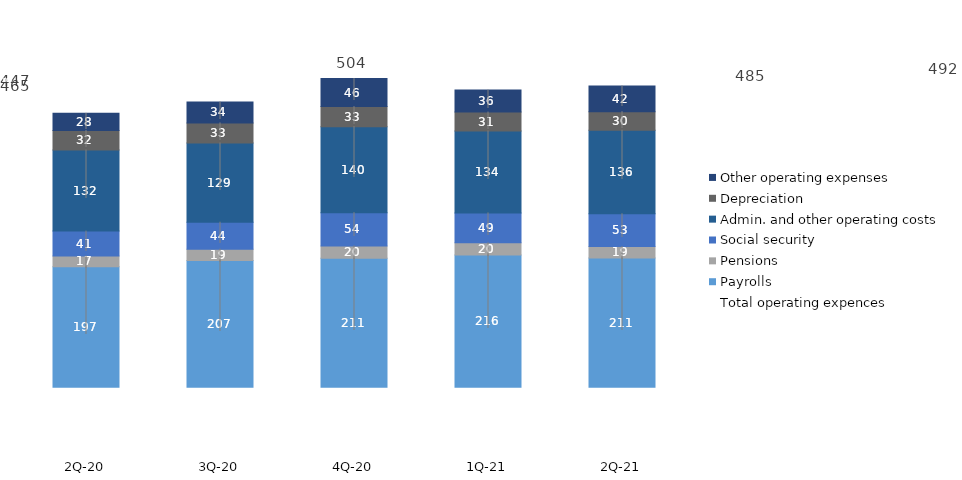
| Category | Payrolls | Pensions | Social security | Admin. and other operating costs | Depreciation | Other operating expenses |
|---|---|---|---|---|---|---|
| 2Q-21 | 210.961 | 18.611 | 53.458 | 136.384 | 30.262 | 41.881 |
| 1Q-21 | 215.824 | 19.858 | 48.709 | 133.755 | 30.808 | 35.9 |
| 4Q-20 | 210.623 | 19.854 | 54.351 | 140.351 | 32.718 | 45.632 |
| 3Q-20 | 206.727 | 18.585 | 43.952 | 129.288 | 32.697 | 34.057 |
| 2Q-20 | 196.66 | 17.386 | 40.656 | 132.408 | 31.771 | 27.996 |